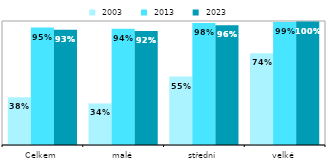
| Category |  2003 |  2013 |  2023 |
|---|---|---|---|
| Celkem | 0.385 | 0.947 | 0.93 |
| malé | 0.335 | 0.937 | 0.92 |
| střední | 0.552 | 0.985 | 0.965 |
| velké | 0.739 | 0.993 | 0.996 |